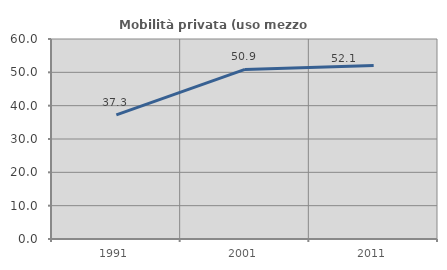
| Category | Mobilità privata (uso mezzo privato) |
|---|---|
| 1991.0 | 37.257 |
| 2001.0 | 50.886 |
| 2011.0 | 52.075 |